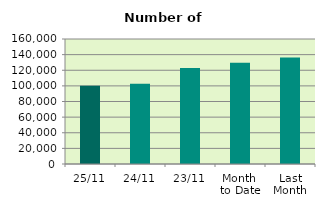
| Category | Series 0 |
|---|---|
| 25/11 | 100038 |
| 24/11 | 102626 |
| 23/11 | 122994 |
| Month 
to Date | 129720.316 |
| Last
Month | 136171.238 |